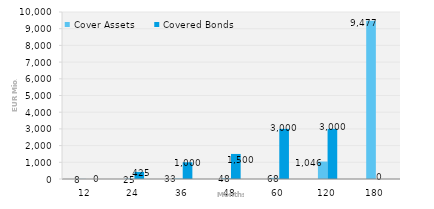
| Category | Cover Assets | Covered Bonds |
|---|---|---|
| 12.0 | 7.845 | 0 |
| 24.0 | 25.042 | 425 |
| 36.0 | 32.956 | 1000 |
| 48.0 | 47.962 | 1500 |
| 60.0 | 68.32 | 3000 |
| 120.0 | 1045.511 | 3000 |
| 180.0 | 9477.397 | 0 |